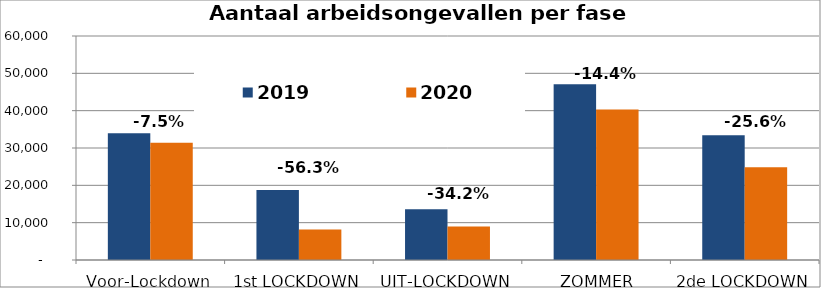
| Category | 2019 | 2020 |
|---|---|---|
| Voor-Lockdown | 33951 | 31391 |
| 1st LOCKDOWN | 18748 | 8193 |
| UIT-LOCKDOWN | 13610 | 8950 |
| ZOMMER PERIODE | 47062 | 40306 |
| 2de LOCKDOWN | 33410 | 24858 |